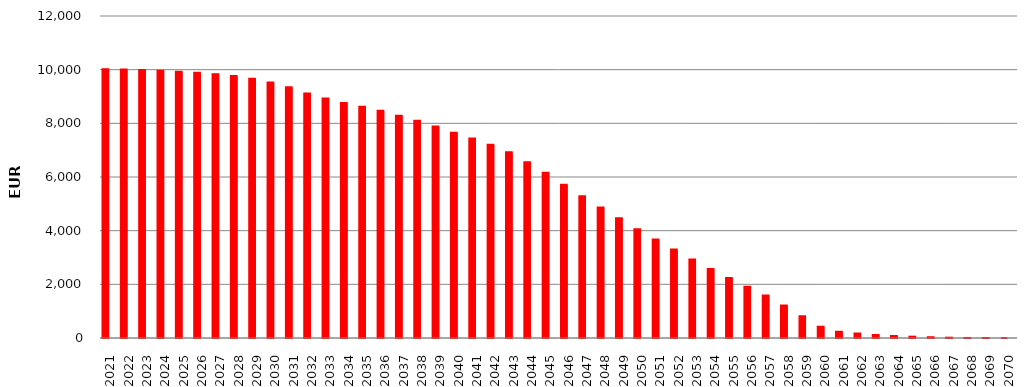
| Category | 10017351007 | SumOfMont Cred Ced act |
|---|---|---|
| 2021 | 10016031909.22 | 1319098.15 |
| 2022 | 10006378328.45 | 9653580.77 |
| 2023 | 9986469941.25 | 19908387.2 |
| 2024 | 9957492941.61 | 28976999.64 |
| 2025 | 9925781078.33 | 31711863.28 |
| 2026 | 9885844862.65 | 39936215.68 |
| 2027 | 9833654104.64 | 52190758.01 |
| 2028 | 9767322663.47 | 66331441.17 |
| 2029 | 9660556645.52 | 106766017.95 |
| 2030 | 9523411653.48 | 137144992.04 |
| 2031 | 9348419922.34 | 174991731.14 |
| 2032 | 9115174758.67 | 233245163.67 |
| 2033 | 8930120843.05 | 185053915.62 |
| 2034 | 8761125181.45 | 168995661.6 |
| 2035 | 8616371686.73 | 144753494.72 |
| 2036 | 8464617177.21 | 151754509.52 |
| 2037 | 8279982799.44 | 184634377.77 |
| 2038 | 8091826615.21 | 188156184.23 |
| 2039 | 7880544855.12 | 211281760.09 |
| 2040 | 7651568005.34 | 228976849.78 |
| 2041 | 7434561463.73 | 217006541.61 |
| 2042 | 7197787543.91 | 236773919.82 |
| 2043 | 6918541577.88 | 279245966.03 |
| 2044 | 6546179667.69 | 372361910.19 |
| 2045 | 6158322290.48 | 387857377.21 |
| 2046 | 5715004476.04 | 443317814.44 |
| 2047 | 5279322192.71 | 435682283.33 |
| 2048 | 4868011636.8 | 411310555.91 |
| 2049 | 4466865346.35 | 401146290.45 |
| 2050 | 4048221462.8 | 418643883.55 |
| 2051 | 3667547391.18 | 380674071.62 |
| 2052 | 3293738911.29 | 373808479.89 |
| 2053 | 2921717396.57 | 372021514.72 |
| 2054 | 2573004265.87 | 348713130.7 |
| 2055 | 2235091708.31 | 337912557.56 |
| 2056 | 1907548302.82 | 327543405.49 |
| 2057 | 1580819200.5 | 326729102.32 |
| 2058 | 1210183672.93 | 370635527.57 |
| 2059 | 807168981.59 | 403014691.34 |
| 2060 | 421179383.94 | 385989597.65 |
| 2061 | 234315861 | 186863522.94 |
| 2062 | 168166403.36 | 66149457.64 |
| 2063 | 113865078.67 | 54301324.69 |
| 2064 | 78472834.03 | 35392244.64 |
| 2065 | 49399586.78 | 29073247.25 |
| 2066 | 29068730.97 | 20330855.81 |
| 2067 | 12142784.25 | 16925946.72 |
| 2068 | 1962933.09 | 10179851.16 |
| 2069 | 352625.8 | 1610307.29 |
| 2070 | 0 | 352625.8 |